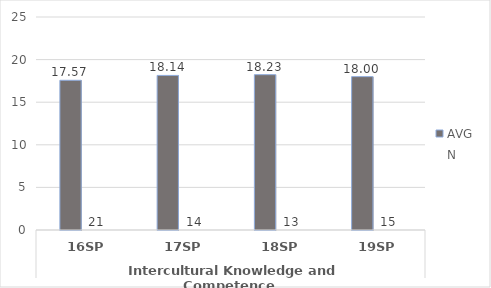
| Category | Human Services - AVG | Human Services - N |
|---|---|---|
| 0 | 17.571 | 21 |
| 1 | 18.143 | 14 |
| 2 | 18.231 | 13 |
| 3 | 18 | 15 |